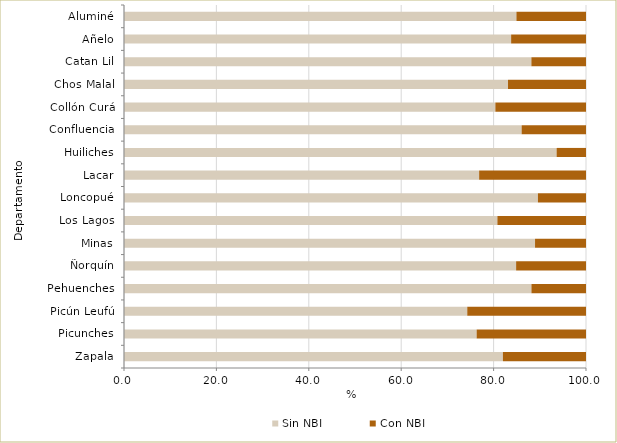
| Category | Sin NBI | Con NBI |
|---|---|---|
| Zapala | 82.013 | 17.987 |
| Picunches | 76.331 | 23.669 |
| Picún Leufú | 74.299 | 25.701 |
| Pehuenches | 88.19 | 11.81 |
| Ñorquín | 84.875 | 15.125 |
| Minas | 88.969 | 11.031 |
| Los Lagos | 80.82 | 19.18 |
| Loncopué | 89.596 | 10.404 |
| Lacar | 76.873 | 23.127 |
| Huiliches | 93.637 | 6.363 |
| Confluencia | 86.069 | 13.931 |
| Collón Curá | 80.382 | 19.618 |
| Chos Malal | 83.119 | 16.881 |
| Catan Lil | 88.178 | 11.822 |
| Añelo | 83.794 | 16.206 |
| Aluminé | 84.939 | 15.061 |